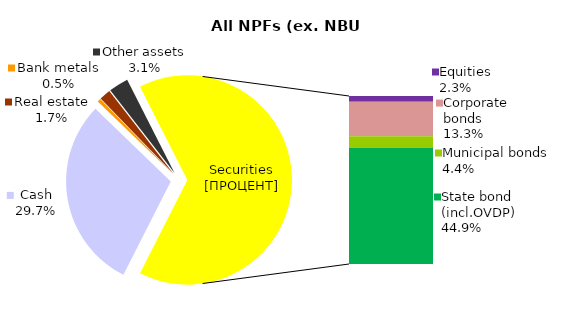
| Category | All NPF (ex. NBU CNPF) |
|---|---|
| Cash | 614.713 |
| Bank metals | 10.719 |
| Real estate | 35.947 |
| Other assets | 63.093 |
| Equities | 46.81 |
| Corporate bonds | 275.263 |
| Municipal bonds | 91.659 |
| State bond (incl.OVDP) | 928.549 |